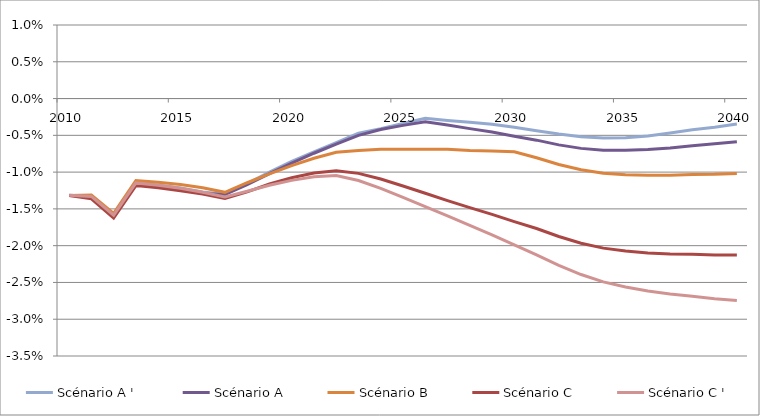
| Category | Scénario A '  | Scénario A | Scénario B | Scénario C | Scénario C ' |
|---|---|---|---|---|---|
| 2010.0 | -0.013 | -0.013 | -0.013 | -0.013 | -0.013 |
| 2011.0 | -0.013 | -0.013 | -0.013 | -0.014 | -0.013 |
| 2012.0 | -0.016 | -0.016 | -0.016 | -0.016 | -0.016 |
| 2013.0 | -0.011 | -0.011 | -0.011 | -0.012 | -0.011 |
| 2014.0 | -0.012 | -0.012 | -0.011 | -0.012 | -0.012 |
| 2015.0 | -0.012 | -0.012 | -0.012 | -0.013 | -0.012 |
| 2016.0 | -0.013 | -0.013 | -0.012 | -0.013 | -0.013 |
| 2017.0 | -0.013 | -0.013 | -0.013 | -0.014 | -0.013 |
| 2018.0 | -0.012 | -0.012 | -0.011 | -0.013 | -0.013 |
| 2019.0 | -0.01 | -0.01 | -0.01 | -0.012 | -0.012 |
| 2020.0 | -0.009 | -0.009 | -0.009 | -0.011 | -0.011 |
| 2021.0 | -0.007 | -0.007 | -0.008 | -0.01 | -0.011 |
| 2022.0 | -0.006 | -0.006 | -0.007 | -0.01 | -0.01 |
| 2023.0 | -0.005 | -0.005 | -0.007 | -0.01 | -0.011 |
| 2024.0 | -0.004 | -0.004 | -0.007 | -0.011 | -0.012 |
| 2025.0 | -0.003 | -0.004 | -0.007 | -0.012 | -0.013 |
| 2026.0 | -0.003 | -0.003 | -0.007 | -0.013 | -0.015 |
| 2027.0 | -0.003 | -0.004 | -0.007 | -0.014 | -0.016 |
| 2028.0 | -0.003 | -0.004 | -0.007 | -0.015 | -0.017 |
| 2029.0 | -0.003 | -0.005 | -0.007 | -0.016 | -0.019 |
| 2030.0 | -0.004 | -0.005 | -0.007 | -0.017 | -0.02 |
| 2031.0 | -0.004 | -0.006 | -0.008 | -0.018 | -0.021 |
| 2032.0 | -0.005 | -0.006 | -0.009 | -0.019 | -0.023 |
| 2033.0 | -0.005 | -0.007 | -0.01 | -0.02 | -0.024 |
| 2034.0 | -0.005 | -0.007 | -0.01 | -0.02 | -0.025 |
| 2035.0 | -0.005 | -0.007 | -0.01 | -0.021 | -0.026 |
| 2036.0 | -0.005 | -0.007 | -0.01 | -0.021 | -0.026 |
| 2037.0 | -0.005 | -0.007 | -0.01 | -0.021 | -0.027 |
| 2038.0 | -0.004 | -0.006 | -0.01 | -0.021 | -0.027 |
| 2039.0 | -0.004 | -0.006 | -0.01 | -0.021 | -0.027 |
| 2040.0 | -0.003 | -0.006 | -0.01 | -0.021 | -0.027 |